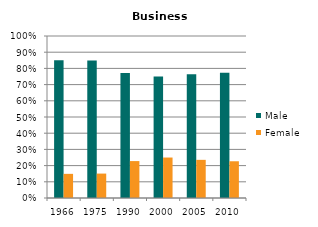
| Category | Male | Female |
|---|---|---|
| 1966.0 | 0.851 | 0.149 |
| 1975.0 | 0.849 | 0.151 |
| 1990.0 | 0.772 | 0.228 |
| 2000.0 | 0.75 | 0.25 |
| 2005.0 | 0.764 | 0.236 |
| 2010.0 | 0.773 | 0.227 |